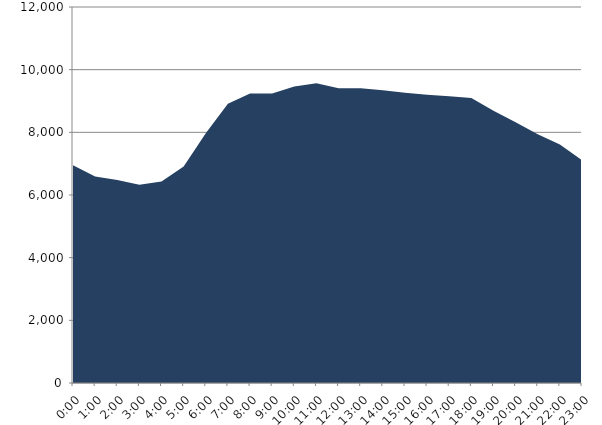
| Category | Series 0 | Series 1 |
|---|---|---|
| 2019-06-19 |  | 6946.19 |
| 2019-06-19 01:00:00 |  | 6590.08 |
| 2019-06-19 02:00:00 |  | 6479.78 |
| 2019-06-19 03:00:00 |  | 6327.02 |
| 2019-06-19 04:00:00 |  | 6427.63 |
| 2019-06-19 05:00:00 |  | 6913.12 |
| 2019-06-19 06:00:00 |  | 7974.17 |
| 2019-06-19 07:00:00 |  | 8908.43 |
| 2019-06-19 08:00:00 |  | 9238.11 |
| 2019-06-19 09:00:00 |  | 9239.13 |
| 2019-06-19 10:00:00 |  | 9465.41 |
| 2019-06-19 11:00:00 |  | 9566.74 |
| 2019-06-19 12:00:00 |  | 9404.45 |
| 2019-06-19 13:00:00 |  | 9410.01 |
| 2019-06-19 14:00:00 |  | 9339.64 |
| 2019-06-19 15:00:00 |  | 9261.39 |
| 2019-06-19 16:00:00 |  | 9198.67 |
| 2019-06-19 17:00:00 |  | 9154.23 |
| 2019-06-19 18:00:00 |  | 9098.26 |
| 2019-06-19 19:00:00 |  | 8689.67 |
| 2019-06-19 20:00:00 |  | 8319.32 |
| 2019-06-19 21:00:00 |  | 7937.79 |
| 2019-06-19 22:00:00 |  | 7610.48 |
| 2019-06-19 23:00:00 |  | 7108.24 |